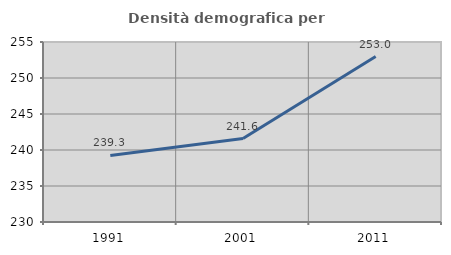
| Category | Densità demografica |
|---|---|
| 1991.0 | 239.25 |
| 2001.0 | 241.594 |
| 2011.0 | 252.985 |